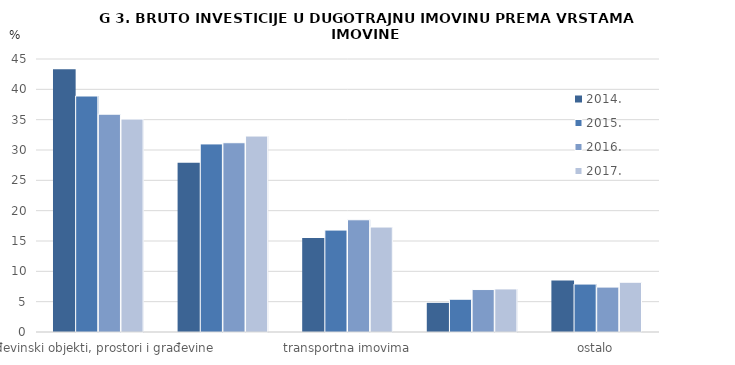
| Category | 2014. | 2015. | 2016. | 2017. |
|---|---|---|---|---|
| građevinski objekti, prostori i građevine      | 43.3 | 38.9 | 35.9 | 35.1 |
| postrojenja i oprema s montažom | 27.9 | 31 | 31.2 | 32.3 |
| transportna imovima | 15.5 | 16.8 | 18.5 | 17.3 |
| intelektualna imovina  | 4.8 | 5.4 | 7 | 7.1 |
| ostalo | 8.5 | 7.9 | 7.4 | 8.2 |